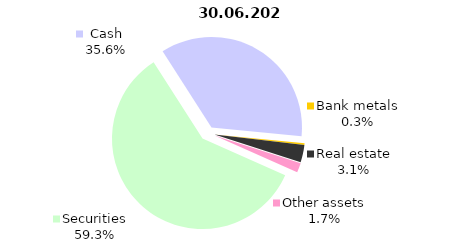
| Category | 30.06.2021 |
|---|---|
| Securities | 2199.916 |
| Cash | 1323.144 |
| Bank metals | 10.719 |
| Real estate | 115.995 |
| Other assets | 63.11 |